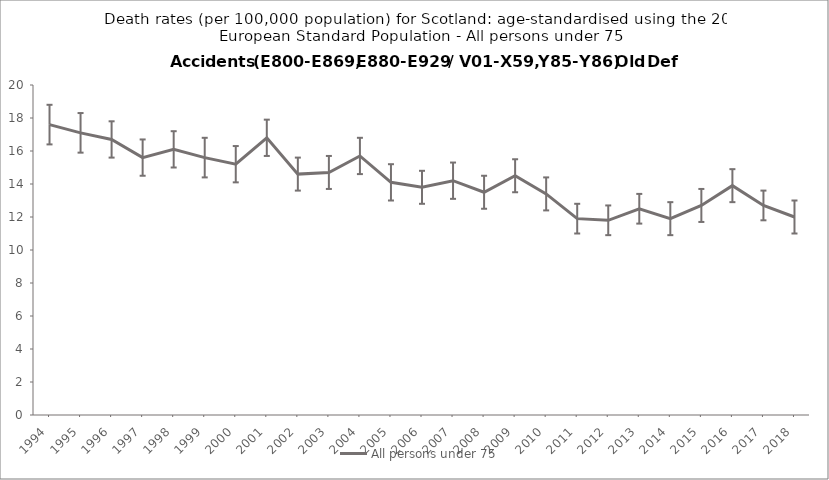
| Category | All persons under 75 |
|---|---|
| 1994.0 | 17.6 |
| 1995.0 | 17.1 |
| 1996.0 | 16.7 |
| 1997.0 | 15.6 |
| 1998.0 | 16.1 |
| 1999.0 | 15.6 |
| 2000.0 | 15.2 |
| 2001.0 | 16.8 |
| 2002.0 | 14.6 |
| 2003.0 | 14.7 |
| 2004.0 | 15.7 |
| 2005.0 | 14.1 |
| 2006.0 | 13.8 |
| 2007.0 | 14.2 |
| 2008.0 | 13.5 |
| 2009.0 | 14.5 |
| 2010.0 | 13.4 |
| 2011.0 | 11.9 |
| 2012.0 | 11.8 |
| 2013.0 | 12.5 |
| 2014.0 | 11.9 |
| 2015.0 | 12.7 |
| 2016.0 | 13.9 |
| 2017.0 | 12.7 |
| 2018.0 | 12 |